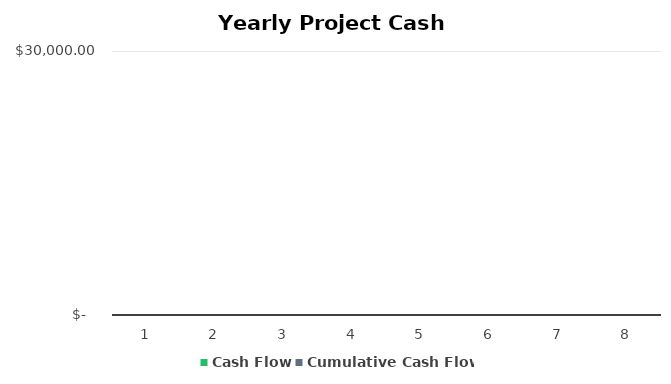
| Category | Cash Flow | Cumulative Cash Flow | Series 2 |
|---|---|---|---|
| 0 | 0 | 0 | 1 |
| 1 | 0 | 0 | 2 |
| 2 | 0 | 0 | 3 |
| 3 | 0 | 0 | 4 |
| 4 | 0 | 0 | 5 |
| 5 | 0 | 0 | 6 |
| 6 | 0 | 0 | 7 |
| 7 | 0 | 0 | 8 |